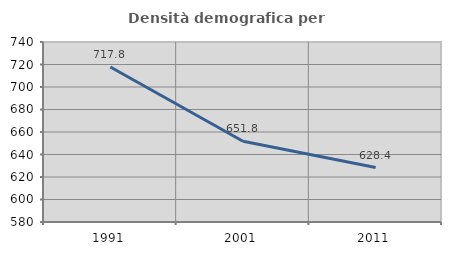
| Category | Densità demografica |
|---|---|
| 1991.0 | 717.8 |
| 2001.0 | 651.776 |
| 2011.0 | 628.427 |